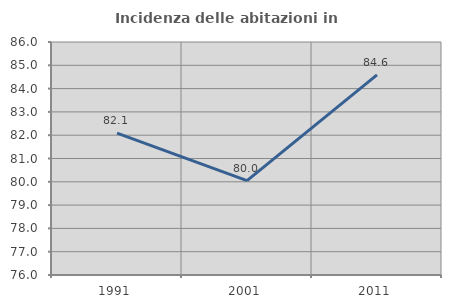
| Category | Incidenza delle abitazioni in proprietà  |
|---|---|
| 1991.0 | 82.085 |
| 2001.0 | 80.05 |
| 2011.0 | 84.591 |